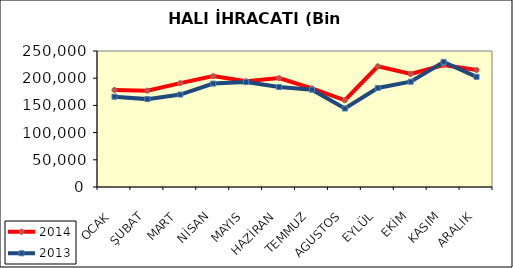
| Category | 2014 | 2013 |
|---|---|---|
| OCAK | 178356.88 | 165972.055 |
| ŞUBAT | 177087.667 | 161550.146 |
| MART | 190935.248 | 169936.276 |
| NİSAN | 203815.347 | 190079.058 |
| MAYIS | 194613.765 | 192843.377 |
| HAZİRAN | 200165.098 | 183761.035 |
| TEMMUZ | 181218.242 | 178911.509 |
| AGUSTOS | 159444.416 | 144298.257 |
| EYLÜL | 221901.096 | 182023.925 |
| EKİM | 207681.194 | 193554.001 |
| KASIM | 224325.45 | 229928.223 |
| ARALIK | 215091.035 | 202542.544 |